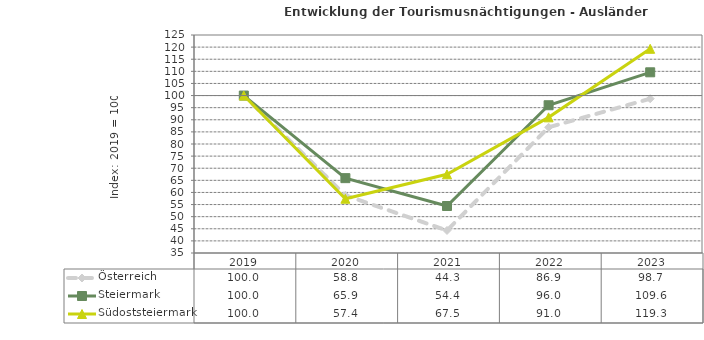
| Category | Österreich | Steiermark | Südoststeiermark |
|---|---|---|---|
| 2023.0 | 98.7 | 109.6 | 119.3 |
| 2022.0 | 86.9 | 96 | 91 |
| 2021.0 | 44.3 | 54.4 | 67.5 |
| 2020.0 | 58.8 | 65.9 | 57.4 |
| 2019.0 | 100 | 100 | 100 |